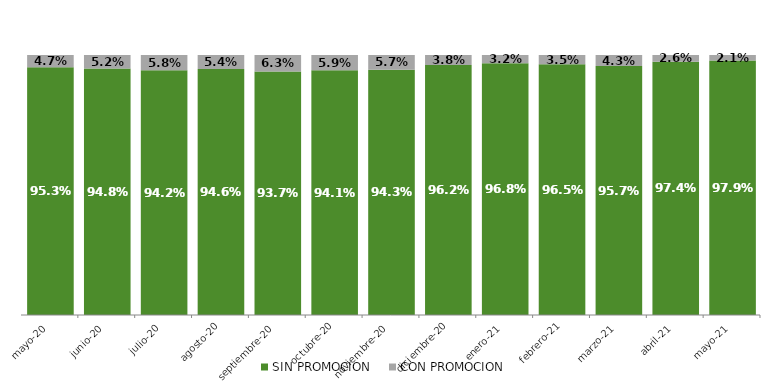
| Category | SIN PROMOCION   | CON PROMOCION   |
|---|---|---|
| 2020-05-01 | 0.953 | 0.047 |
| 2020-06-01 | 0.948 | 0.052 |
| 2020-07-01 | 0.942 | 0.058 |
| 2020-08-01 | 0.946 | 0.054 |
| 2020-09-01 | 0.937 | 0.063 |
| 2020-10-01 | 0.941 | 0.059 |
| 2020-11-01 | 0.943 | 0.057 |
| 2020-12-01 | 0.962 | 0.038 |
| 2021-01-01 | 0.968 | 0.032 |
| 2021-02-01 | 0.965 | 0.035 |
| 2021-03-01 | 0.957 | 0.043 |
| 2021-04-01 | 0.974 | 0.026 |
| 2021-05-01 | 0.979 | 0.021 |